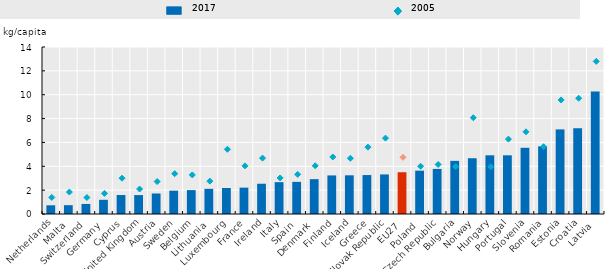
| Category | 2017 |
|---|---|
| Netherlands | 0.73 |
| Malta | 0.739 |
| Switzerland | 0.843 |
| Germany | 1.19 |
| Cyprus | 1.59 |
| United Kingdom | 1.587 |
| Austria | 1.719 |
| Sweden | 1.957 |
| Belgium | 2.002 |
| Lithuania | 2.111 |
| Luxembourg | 2.182 |
| France | 2.21 |
| Ireland | 2.536 |
| Italy | 2.669 |
| Spain | 2.693 |
| Denmark | 2.921 |
| Finland | 3.234 |
| Iceland | 3.243 |
| Greece | 3.265 |
| Slovak Republic | 3.318 |
| EU27 | 3.501 |
| Poland | 3.632 |
| Czech Republic | 3.779 |
| Bulgaria | 4.454 |
| Norway | 4.675 |
| Hungary | 4.92 |
| Portugal | 4.92 |
| Slovenia | 5.551 |
| Romania | 5.67 |
| Estonia | 7.091 |
| Croatia | 7.18 |
| Latvia | 10.266 |